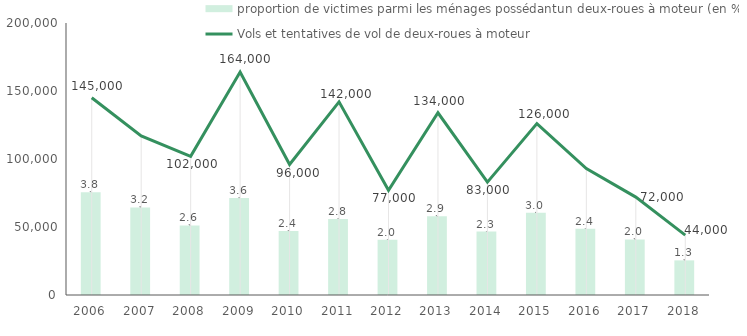
| Category | proportion de victimes parmi les ménages possédantun deux-roues à moteur (en %) |
|---|---|
| 2006.0 | 3.781 |
| 2007.0 | 3.218 |
| 2008.0 | 2.557 |
| 2009.0 | 3.562 |
| 2010.0 | 2.35 |
| 2011.0 | 2.799 |
| 2012.0 | 2.034 |
| 2013.0 | 2.892 |
| 2014.0 | 2.335 |
| 2015.0 | 3.026 |
| 2016.0 | 2.439 |
| 2017.0 | 2.042 |
| 2018.0 | 1.273 |